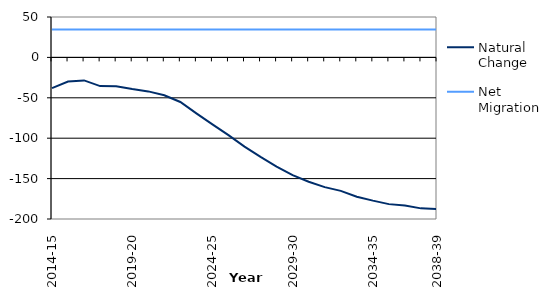
| Category | Natural Change | Net Migration |
|---|---|---|
| 2014-15 | -38.005 | 34.475 |
|  | -29.904 | 34.475 |
|  | -28.471 | 34.475 |
|  | -35.538 | 34.475 |
|  | -35.631 | 34.475 |
| 2019-20 | -39.129 | 34.475 |
|  | -42.064 | 34.475 |
|  | -46.853 | 34.475 |
|  | -55.142 | 34.475 |
|  | -69.225 | 34.475 |
| 2024-25 | -82.847 | 34.475 |
|  | -96.211 | 34.475 |
|  | -110.442 | 34.475 |
|  | -123.171 | 34.475 |
|  | -135.114 | 34.475 |
| 2029-30 | -145.784 | 34.475 |
|  | -153.937 | 34.475 |
|  | -160.573 | 34.475 |
|  | -165.196 | 34.475 |
|  | -172.369 | 34.475 |
| 2034-35 | -177.241 | 34.475 |
|  | -181.592 | 34.475 |
|  | -183.408 | 34.475 |
|  | -186.836 | 34.475 |
| 2038-39 | -187.771 | 34.475 |